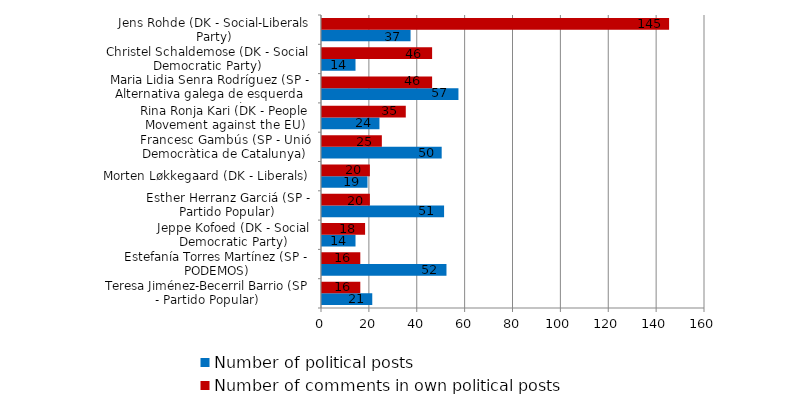
| Category | Number of political posts | Number of comments in own political posts |
|---|---|---|
| Teresa Jiménez-Becerril Barrio (SP - Partido Popular) | 21 | 16 |
| Estefanía Torres Martínez (SP - PODEMOS) | 52 | 16 |
| Jeppe Kofoed (DK - Social Democratic Party) | 14 | 18 |
| Esther Herranz Garciá (SP - Partido Popular) | 51 | 20 |
| Morten Løkkegaard (DK - Liberals) | 19 | 20 |
| Francesc Gambús (SP - Unió Democràtica de Catalunya) | 50 | 25 |
| Rina Ronja Kari (DK - People Movement against the EU) | 24 | 35 |
| Maria Lidia Senra Rodríguez (SP - Alternativa galega de esquerda en Europa) | 57 | 46 |
| Christel Schaldemose (DK - Social Democratic Party) | 14 | 46 |
| Jens Rohde (DK - Social-Liberals Party) | 37 | 145 |